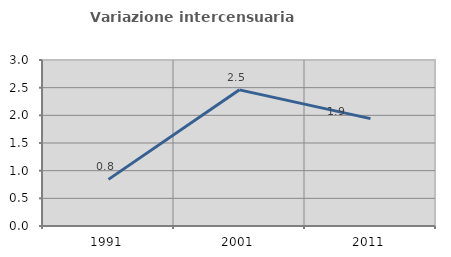
| Category | Variazione intercensuaria annua |
|---|---|
| 1991.0 | 0.843 |
| 2001.0 | 2.46 |
| 2011.0 | 1.941 |